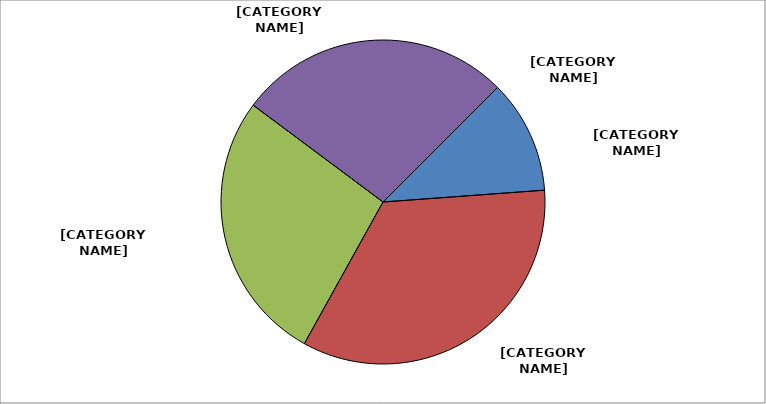
| Category | Series 0 |
|---|---|
| Local Government Contributions | 0.113 |
| Licenses, Permits & Fees | 0.341 |
| State Funded Expenditures | 0.27 |
| Federal Funded Expenditures | 0.272 |
| Other Funded Expenditures | 0 |